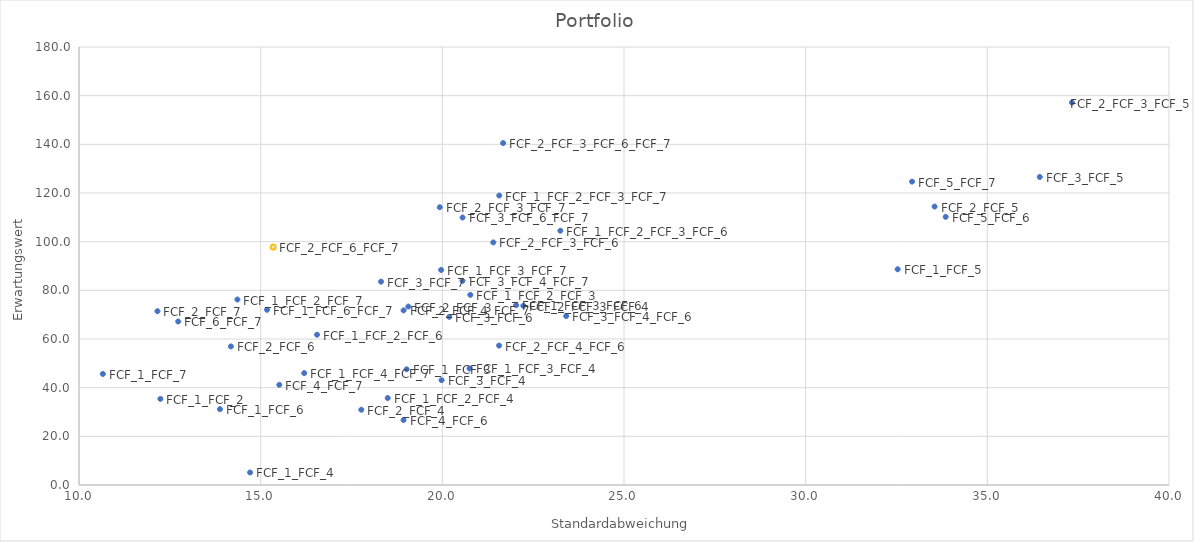
| Category | Portfolio |
|---|---|
| 12.239412337578266 | 35.398 |
| 19.015961456391555 | 47.548 |
| 14.7087902406545 | 5.15 |
| 32.53211899580805 | 88.654 |
| 13.87943301785316 | 31.175 |
| 10.656830419684496 | 45.64 |
| 19.06441724985795 | 73.326 |
| 17.769728436234374 | 30.927 |
| 33.54830729187725 | 114.431 |
| 14.180528923480042 | 56.952 |
| 12.15961157328171 | 71.417 |
| 19.978837265100324 | 43.078 |
| 36.44297631213733 | 126.582 |
| 20.18954181119745 | 69.103 |
| 18.31303666029135 | 83.568 |
| 18.931926673687673 | 26.704 |
| 15.512443716036671 | 41.169 |
| 33.85374658126134 | 110.208 |
| 32.92822185326532 | 124.673 |
| 12.730648837953142 | 67.194 |
| 20.769926763558836 | 78.136 |
| 18.49706549388762 | 35.737 |
| 16.55100558592551 | 61.762 |
| 14.360258474695208 | 76.228 |
| 20.74773502147029 | 47.888 |
| 22.031849009329765 | 73.913 |
| 19.96658629902157 | 88.378 |
| 16.197947316220127 | 45.979 |
| 15.174887453261256 | 72.004 |
| 22.22901838187583 | 73.665 |
| 37.32840636608164 | 157.169 |
| 21.403203539871573 | 99.69 |
| 19.92984442493552 | 114.156 |
| 21.561707369546017 | 57.291 |
| 18.933492837116216 | 71.757 |
| 15.343235130567246 | 97.782 |
| 23.408565175607027 | 69.442 |
| 20.555092070226546 | 83.907 |
| 20.55697038726342 | 109.932 |
| 23.24825873670465 | 104.5 |
| 21.566075113775618 | 118.966 |
| 21.672944295826838 | 140.52 |